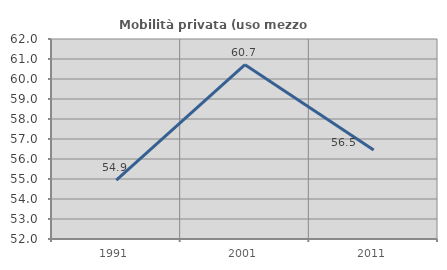
| Category | Mobilità privata (uso mezzo privato) |
|---|---|
| 1991.0 | 54.945 |
| 2001.0 | 60.714 |
| 2011.0 | 56.452 |